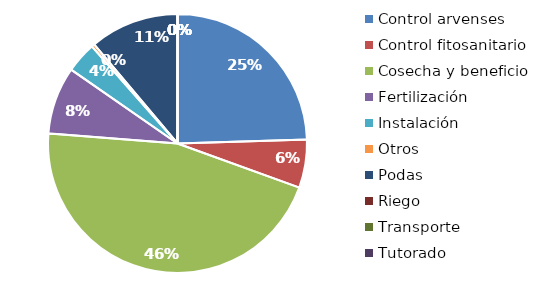
| Category | Valor |
|---|---|
| Control arvenses | 6520000 |
| Control fitosanitario | 1600000 |
| Cosecha y beneficio | 12160000 |
| Fertilización | 2240000 |
| Instalación | 1020000 |
| Otros | 100000 |
| Podas | 2960000 |
| Riego | 0 |
| Transporte | 0 |
| Tutorado | 0 |